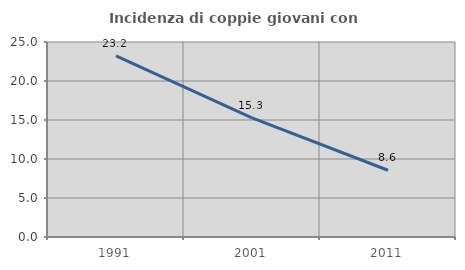
| Category | Incidenza di coppie giovani con figli |
|---|---|
| 1991.0 | 23.224 |
| 2001.0 | 15.265 |
| 2011.0 | 8.558 |